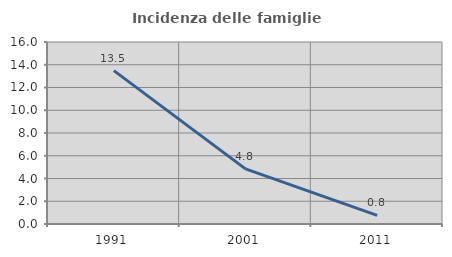
| Category | Incidenza delle famiglie numerose |
|---|---|
| 1991.0 | 13.485 |
| 2001.0 | 4.847 |
| 2011.0 | 0.759 |